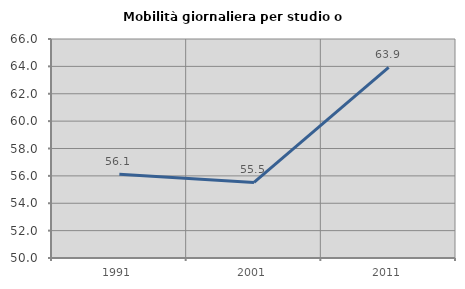
| Category | Mobilità giornaliera per studio o lavoro |
|---|---|
| 1991.0 | 56.119 |
| 2001.0 | 55.525 |
| 2011.0 | 63.934 |